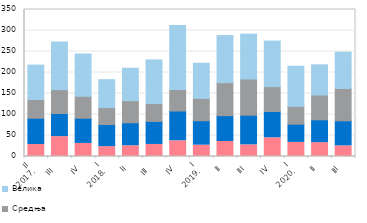
| Category | Микропредузећа | Мала | Средња | Велика |
|---|---|---|---|---|
| II
2017. | 28.601 | 62.573 | 44.608 | 81.806 |
| III  | 47.306 | 54.987 | 56.8 | 113.518 |
| IV | 31.129 | 59.946 | 52.372 | 100.581 |
| I
2018. | 23.458 | 52.774 | 40.183 | 66.517 |
| II | 25.544 | 54.802 | 52.603 | 77.229 |
| III  | 28.673 | 54.873 | 42.484 | 103.899 |
| IV | 37.41 | 70.984 | 51.038 | 152.215 |
| I
2019. | 26.913 | 58.293 | 53.033 | 83.702 |
| II | 35.763 | 61.475 | 78.723 | 111.897 |
| III | 27.759 | 70.634 | 86.103 | 106.825 |
| IV | 44.489 | 62.561 | 59.132 | 108.665 |
| I
2020. | 33.497 | 43.549 | 42.255 | 95.672 |
| II | 32.96 | 54.335 | 59 | 72.028 |
| III | 25.293 | 59.78 | 76.792 | 86.501 |